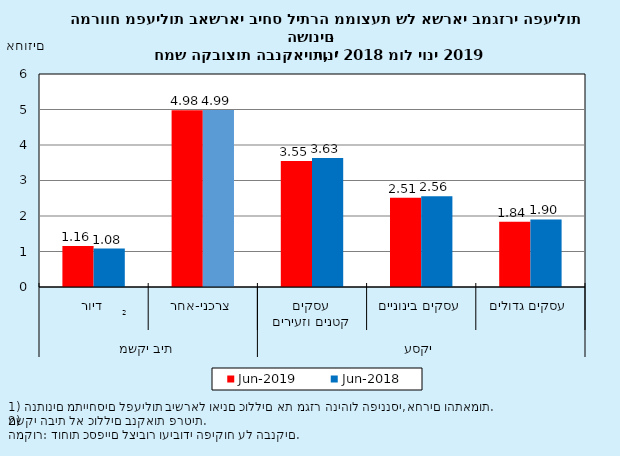
| Category | יונ-2019 | יונ-2018 |
|---|---|---|
| 0 | 1.157 | 1.082 |
| 1 | 4.977 | 4.985 |
| 2 | 3.55 | 3.631 |
| 3 | 2.515 | 2.556 |
| 4 | 1.841 | 1.904 |